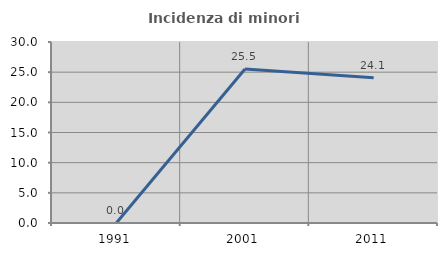
| Category | Incidenza di minori stranieri |
|---|---|
| 1991.0 | 0 |
| 2001.0 | 25.532 |
| 2011.0 | 24.079 |